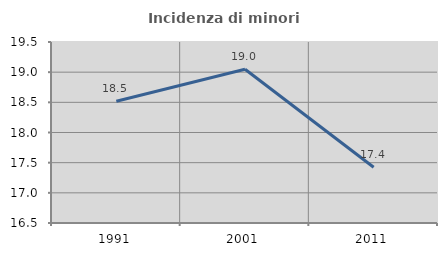
| Category | Incidenza di minori stranieri |
|---|---|
| 1991.0 | 18.519 |
| 2001.0 | 19.048 |
| 2011.0 | 17.424 |